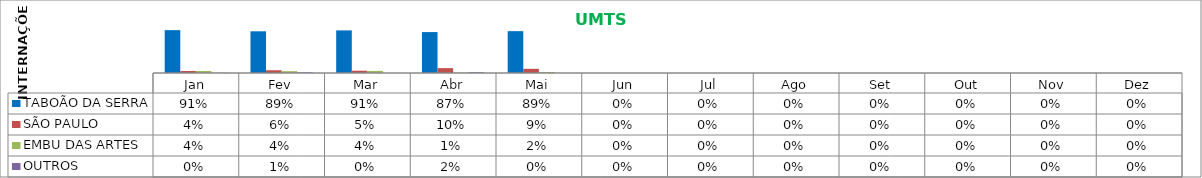
| Category | TABOÃO DA SERRA | SÃO PAULO | EMBU DAS ARTES | OUTROS |
|---|---|---|---|---|
| Jan | 0.912 | 0.042 | 0.042 | 0.004 |
| Fev | 0.887 | 0.059 | 0.039 | 0.015 |
| Mar | 0.907 | 0.049 | 0.045 | 0 |
| Abr | 0.871 | 0.103 | 0.009 | 0.017 |
| Mai | 0.89 | 0.089 | 0.021 | 0 |
| Jun | 0 | 0 | 0 | 0 |
| Jul | 0 | 0 | 0 | 0 |
| Ago | 0 | 0 | 0 | 0 |
| Set | 0 | 0 | 0 | 0 |
| Out | 0 | 0 | 0 | 0 |
| Nov | 0 | 0 | 0 | 0 |
| Dez | 0 | 0 | 0 | 0 |